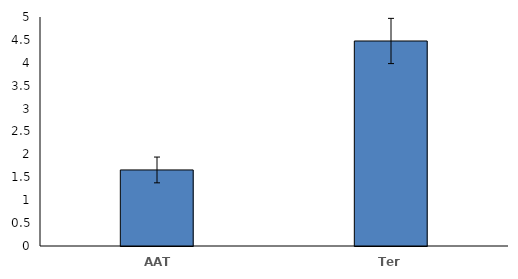
| Category | Series 0 |
|---|---|
| AAT | 1.661 |
| Ter | 4.476 |